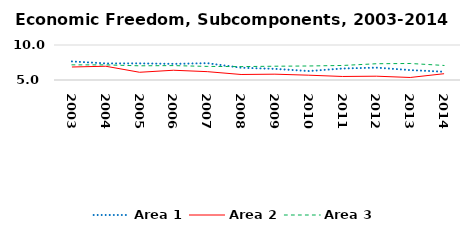
| Category | Area 1 | Area 2 | Area 3 |
|---|---|---|---|
| 2003.0 | 7.655 | 6.858 | 7.164 |
| 2004.0 | 7.368 | 6.965 | 7.159 |
| 2005.0 | 7.373 | 6.104 | 7.026 |
| 2006.0 | 7.305 | 6.393 | 7.058 |
| 2007.0 | 7.404 | 6.193 | 6.942 |
| 2008.0 | 6.751 | 5.787 | 6.913 |
| 2009.0 | 6.592 | 5.832 | 6.969 |
| 2010.0 | 6.28 | 5.687 | 7.001 |
| 2011.0 | 6.644 | 5.503 | 7.076 |
| 2012.0 | 6.768 | 5.544 | 7.323 |
| 2013.0 | 6.417 | 5.36 | 7.36 |
| 2014.0 | 6.182 | 5.899 | 7.078 |